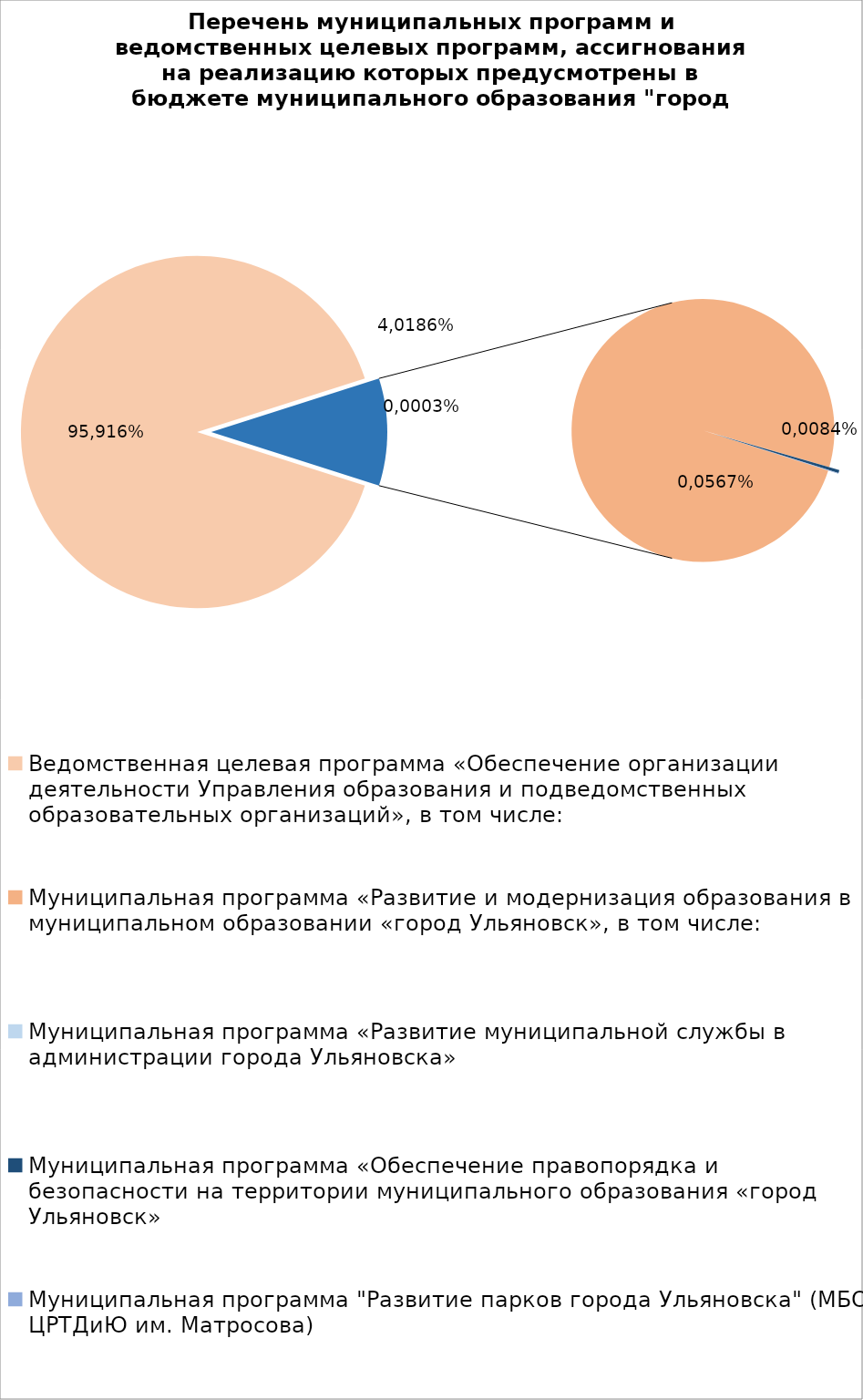
| Category | Series 0 |
|---|---|
| Ведомственная целевая программа «Обеспечение организации деятельности Управления образования и подведомственных образовательных организаций», в том числе: | 6508937.98 |
| Муниципальная программа «Развитие и модернизация образования в муниципальном образовании «город Ульяновск», в том числе: | 707412.81 |
| Муниципальная программа «Развитие муниципальной службы в администрации города Ульяновска» | 14.3 |
| Муниципальная программа «Обеспечение правопорядка и безопасности на территории муниципального образования «город Ульяновск» | 2700 |
| Муниципальная программа "Развитие парков города Ульяновска" (МБОУ ЦРТДиЮ им. Матросова) | 400 |